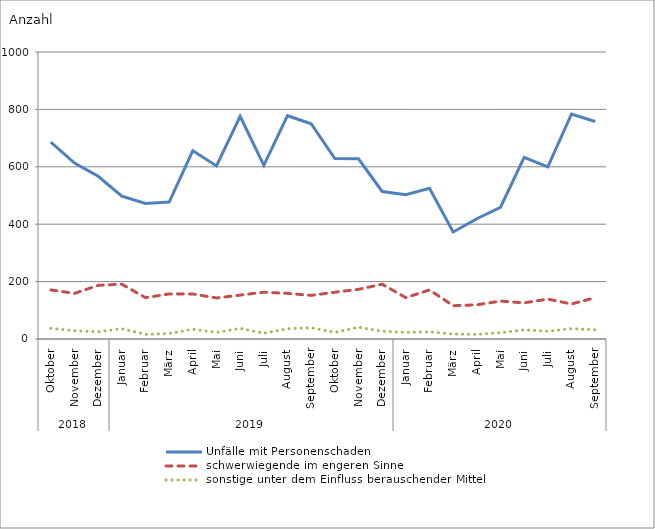
| Category | Unfälle mit Personenschaden | schwerwiegende im engeren Sinne | sonstige unter dem Einfluss berauschender Mittel |
|---|---|---|---|
| 0 | 686 | 171 | 37 |
| 1 | 613 | 159 | 29 |
| 2 | 567 | 187 | 25 |
| 3 | 498 | 191 | 36 |
| 4 | 472 | 144 | 16 |
| 5 | 477 | 157 | 19 |
| 6 | 656 | 157 | 34 |
| 7 | 603 | 143 | 23 |
| 8 | 776 | 153 | 37 |
| 9 | 605 | 163 | 20 |
| 10 | 778 | 159 | 36 |
| 11 | 750 | 152 | 39 |
| 12 | 629 | 163 | 23 |
| 13 | 628 | 173 | 41 |
| 14 | 514 | 191 | 27 |
| 15 | 503 | 144 | 23 |
| 16 | 525 | 171 | 25 |
| 17 | 373 | 116 | 17 |
| 18 | 419 | 119 | 16 |
| 19 | 459 | 132 | 22 |
| 20 | 633 | 126 | 32 |
| 21 | 600 | 139 | 27 |
| 22 | 784 | 122 | 36 |
| 23 | 758 | 144 | 32 |